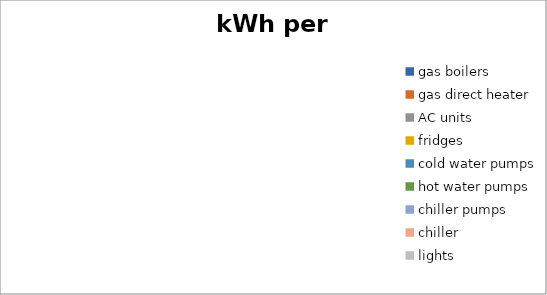
| Category | kWh per year |
|---|---|
| gas boilers | 0 |
| gas direct heater | 0 |
| AC units | 0 |
| fridges | 0 |
| cold water pumps | 0 |
| hot water pumps | 0 |
| chiller pumps | 0 |
| chiller | 0 |
| lights | 0 |